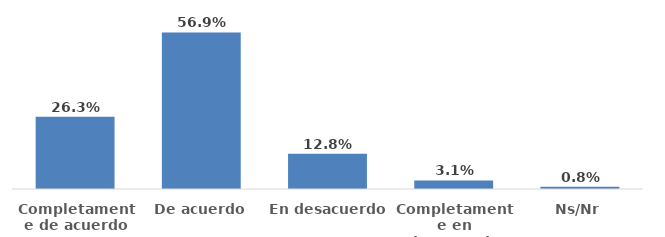
| Category | Series 0 |
|---|---|
| Completamente de acuerdo | 0.263 |
| De acuerdo | 0.569 |
| En desacuerdo | 0.128 |
| Completamente en desacuerdo | 0.031 |
| Ns/Nr | 0.008 |